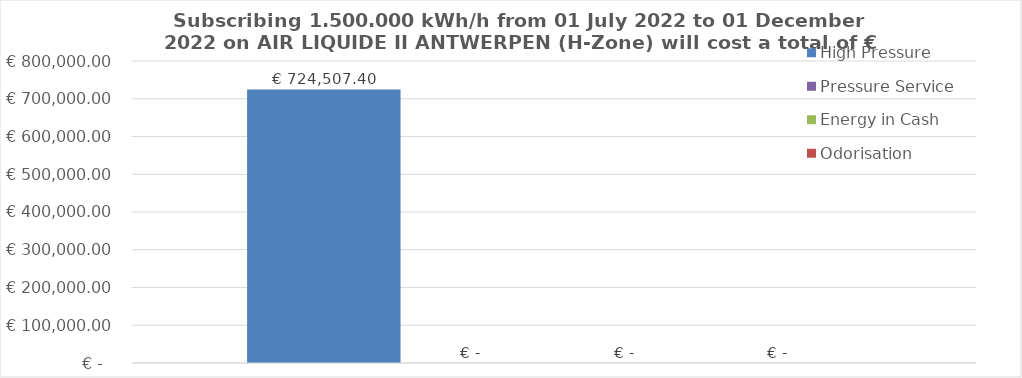
| Category | High Pressure | Pressure Service | Energy in Cash  | Odorisation |
|---|---|---|---|---|
|  | 724507.397 | 0 | 0 | 0 |